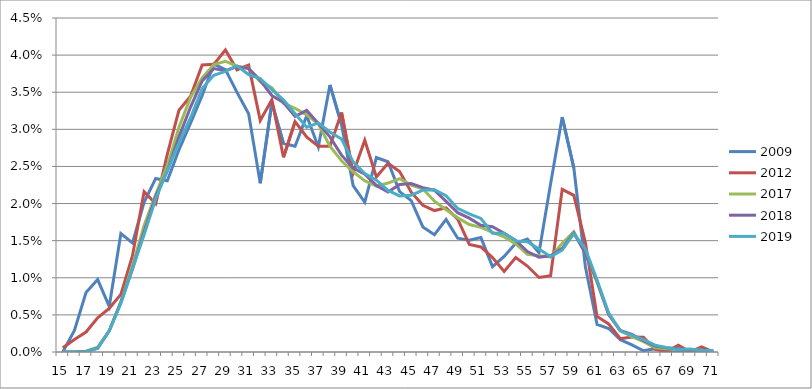
| Category | 2009 | 2012 | 2017 | 2018 | 2019 |
|---|---|---|---|---|---|
| 15.0 | 0 | 0.001 | 0 | 0 | 0 |
| 16.0 | 0.003 | 0.002 | 0 | 0 | 0 |
| 17.0 | 0.008 | 0.003 | 0 | 0 | 0 |
| 18.0 | 0.01 | 0.005 | 0.001 | 0.001 | 0 |
| 19.0 | 0.006 | 0.006 | 0.003 | 0.003 | 0.003 |
| 20.0 | 0.016 | 0.008 | 0.007 | 0.007 | 0.007 |
| 21.0 | 0.015 | 0.013 | 0.012 | 0.011 | 0.011 |
| 22.0 | 0.02 | 0.022 | 0.017 | 0.016 | 0.016 |
| 23.0 | 0.023 | 0.02 | 0.021 | 0.021 | 0.021 |
| 24.0 | 0.023 | 0.027 | 0.025 | 0.024 | 0.024 |
| 25.0 | 0.027 | 0.033 | 0.03 | 0.029 | 0.028 |
| 26.0 | 0.031 | 0.034 | 0.034 | 0.033 | 0.032 |
| 27.0 | 0.035 | 0.039 | 0.037 | 0.037 | 0.036 |
| 28.0 | 0.039 | 0.039 | 0.039 | 0.038 | 0.037 |
| 29.0 | 0.038 | 0.041 | 0.039 | 0.038 | 0.038 |
| 30.0 | 0.035 | 0.038 | 0.039 | 0.038 | 0.039 |
| 31.0 | 0.032 | 0.039 | 0.038 | 0.038 | 0.037 |
| 32.0 | 0.023 | 0.031 | 0.036 | 0.037 | 0.037 |
| 33.0 | 0.034 | 0.034 | 0.036 | 0.035 | 0.035 |
| 34.0 | 0.028 | 0.026 | 0.034 | 0.034 | 0.034 |
| 35.0 | 0.028 | 0.031 | 0.033 | 0.032 | 0.032 |
| 36.0 | 0.032 | 0.029 | 0.032 | 0.033 | 0.03 |
| 37.0 | 0.028 | 0.028 | 0.031 | 0.031 | 0.031 |
| 38.0 | 0.036 | 0.028 | 0.028 | 0.029 | 0.03 |
| 39.0 | 0.031 | 0.032 | 0.026 | 0.027 | 0.029 |
| 40.0 | 0.022 | 0.024 | 0.024 | 0.025 | 0.026 |
| 41.0 | 0.02 | 0.029 | 0.023 | 0.024 | 0.024 |
| 42.0 | 0.026 | 0.024 | 0.022 | 0.022 | 0.023 |
| 43.0 | 0.026 | 0.025 | 0.023 | 0.022 | 0.022 |
| 44.0 | 0.022 | 0.024 | 0.023 | 0.023 | 0.021 |
| 45.0 | 0.02 | 0.022 | 0.022 | 0.023 | 0.021 |
| 46.0 | 0.017 | 0.02 | 0.022 | 0.022 | 0.022 |
| 47.0 | 0.016 | 0.019 | 0.02 | 0.022 | 0.022 |
| 48.0 | 0.018 | 0.019 | 0.019 | 0.02 | 0.021 |
| 49.0 | 0.015 | 0.018 | 0.018 | 0.019 | 0.019 |
| 50.0 | 0.015 | 0.014 | 0.017 | 0.018 | 0.019 |
| 51.0 | 0.015 | 0.014 | 0.017 | 0.017 | 0.018 |
| 52.0 | 0.011 | 0.013 | 0.016 | 0.017 | 0.016 |
| 53.0 | 0.013 | 0.011 | 0.016 | 0.016 | 0.016 |
| 54.0 | 0.015 | 0.013 | 0.015 | 0.015 | 0.015 |
| 55.0 | 0.015 | 0.012 | 0.013 | 0.014 | 0.015 |
| 56.0 | 0.013 | 0.01 | 0.013 | 0.013 | 0.014 |
| 57.0 | 0.023 | 0.01 | 0.013 | 0.013 | 0.013 |
| 58.0 | 0.032 | 0.022 | 0.015 | 0.014 | 0.014 |
| 59.0 | 0.025 | 0.021 | 0.016 | 0.016 | 0.016 |
| 60.0 | 0.011 | 0.015 | 0.013 | 0.013 | 0.014 |
| 61.0 | 0.004 | 0.005 | 0.009 | 0.01 | 0.01 |
| 62.0 | 0.003 | 0.004 | 0.005 | 0.005 | 0.005 |
| 63.0 | 0.002 | 0.002 | 0.003 | 0.003 | 0.003 |
| 64.0 | 0.001 | 0.002 | 0.002 | 0.002 | 0.002 |
| 65.0 | 0 | 0.002 | 0.001 | 0.002 | 0.002 |
| 66.0 | 0 | 0 | 0.001 | 0.001 | 0.001 |
| 67.0 | 0 | 0 | 0 | 0.001 | 0.001 |
| 68.0 | 0 | 0.001 | 0 | 0 | 0 |
| 69.0 | 0 | 0 | 0 | 0 | 0 |
| 70.0 | 0 | 0.001 | 0 | 0 | 0 |
| 71.0 | 0 | 0 | 0 | 0 | 0 |